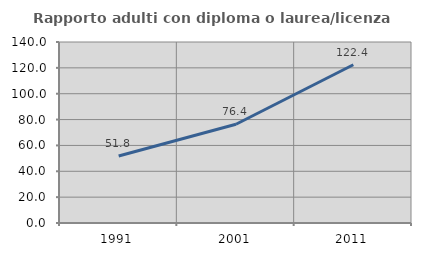
| Category | Rapporto adulti con diploma o laurea/licenza media  |
|---|---|
| 1991.0 | 51.816 |
| 2001.0 | 76.375 |
| 2011.0 | 122.391 |